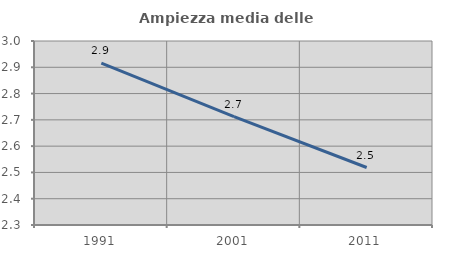
| Category | Ampiezza media delle famiglie |
|---|---|
| 1991.0 | 2.916 |
| 2001.0 | 2.712 |
| 2011.0 | 2.519 |